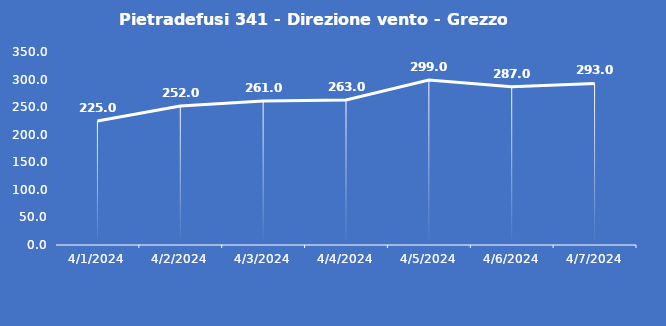
| Category | Pietradefusi 341 - Direzione vento - Grezzo (°N) |
|---|---|
| 4/1/24 | 225 |
| 4/2/24 | 252 |
| 4/3/24 | 261 |
| 4/4/24 | 263 |
| 4/5/24 | 299 |
| 4/6/24 | 287 |
| 4/7/24 | 293 |